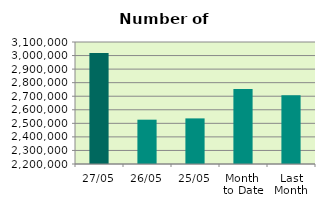
| Category | Series 0 |
|---|---|
| 27/05 | 3018002 |
| 26/05 | 2526936 |
| 25/05 | 2536472 |
| Month 
to Date | 2752838.737 |
| Last
Month | 2707305.9 |